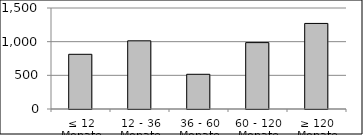
| Category | Volumen |
|---|---|
| ≤ 12 Monate | 812386684.98 |
| 12 - 36 Monate | 1012550379.94 |
| 36 - 60 Monate | 515507746.35 |
| 60 - 120 Monate | 985855999.05 |
| ≥ 120 Monate | 1270764454.626 |